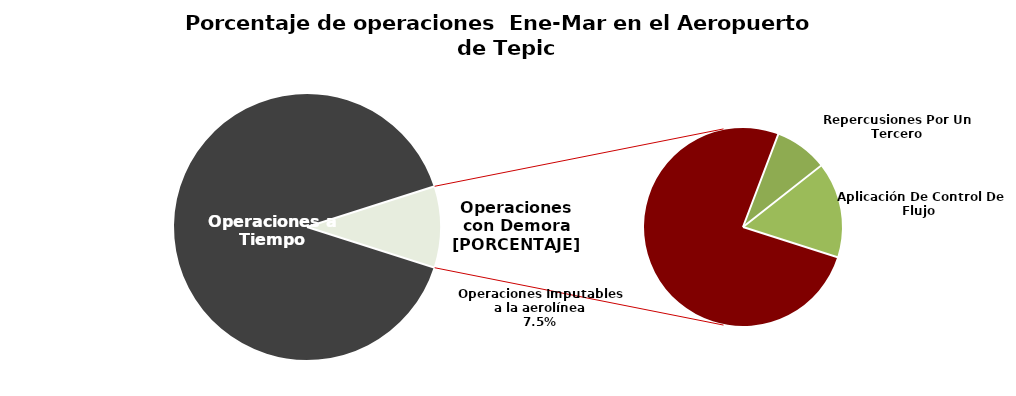
| Category | Series 0 |
|---|---|
| Operaciones a Tiempo | 532 |
| Operaciones Imputables a la aerolínea | 44 |
| Repercusiones Por Un Tercero | 5 |
| Aplicación De Control De Flujo  | 9 |